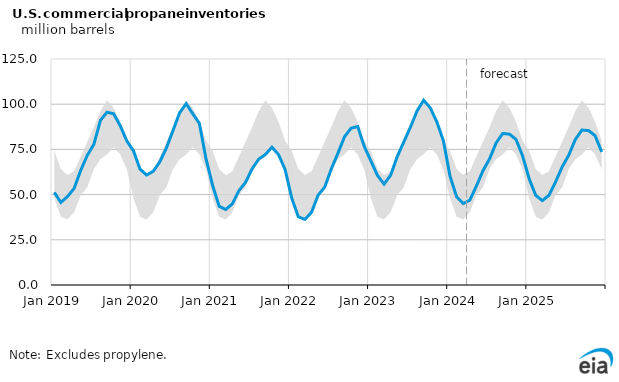
| Category | U.S propane inventories |
|---|---|
| 2019-01-01 | 51.202 |
| 2019-02-01 | 45.695 |
| 2019-03-01 | 48.929 |
| 2019-04-01 | 53.39 |
| 2019-05-01 | 63.351 |
| 2019-06-01 | 71.698 |
| 2019-07-01 | 77.807 |
| 2019-08-01 | 91.091 |
| 2019-09-01 | 95.594 |
| 2019-10-01 | 94.675 |
| 2019-11-01 | 88.094 |
| 2019-12-01 | 79.656 |
| 2020-01-01 | 74.251 |
| 2020-02-01 | 64.101 |
| 2020-03-01 | 60.81 |
| 2020-04-01 | 62.905 |
| 2020-05-01 | 68.11 |
| 2020-06-01 | 75.803 |
| 2020-07-01 | 85.443 |
| 2020-08-01 | 95.255 |
| 2020-09-01 | 100.314 |
| 2020-10-01 | 94.662 |
| 2020-11-01 | 89.388 |
| 2020-12-01 | 69.856 |
| 2021-01-01 | 55.151 |
| 2021-02-01 | 43.514 |
| 2021-03-01 | 41.745 |
| 2021-04-01 | 44.916 |
| 2021-05-01 | 52.225 |
| 2021-06-01 | 56.785 |
| 2021-07-01 | 64.31 |
| 2021-08-01 | 69.606 |
| 2021-09-01 | 72.167 |
| 2021-10-01 | 76.199 |
| 2021-11-01 | 72.115 |
| 2021-12-01 | 63.839 |
| 2022-01-01 | 48.019 |
| 2022-02-01 | 37.734 |
| 2022-03-01 | 36.266 |
| 2022-04-01 | 40.214 |
| 2022-05-01 | 49.671 |
| 2022-06-01 | 54.127 |
| 2022-07-01 | 64.161 |
| 2022-08-01 | 72.838 |
| 2022-09-01 | 81.98 |
| 2022-10-01 | 86.724 |
| 2022-11-01 | 87.672 |
| 2022-12-01 | 76.642 |
| 2023-01-01 | 68.627 |
| 2023-02-01 | 60.61 |
| 2023-03-01 | 55.831 |
| 2023-04-01 | 60.752 |
| 2023-05-01 | 71.059 |
| 2023-06-01 | 79.17 |
| 2023-07-01 | 87.327 |
| 2023-08-01 | 96.275 |
| 2023-09-01 | 102.18 |
| 2023-10-01 | 98.028 |
| 2023-11-01 | 90.236 |
| 2023-12-01 | 79.754 |
| 2024-01-01 | 60.189 |
| 2024-02-01 | 48.798 |
| 2024-03-01 | 45.05 |
| 2024-04-01 | 46.899 |
| 2024-05-01 | 54.731 |
| 2024-06-01 | 63.252 |
| 2024-07-01 | 69.786 |
| 2024-08-01 | 78.621 |
| 2024-09-01 | 83.832 |
| 2024-10-01 | 83.442 |
| 2024-11-01 | 80.526 |
| 2024-12-01 | 71.495 |
| 2025-01-01 | 58.775 |
| 2025-02-01 | 49.558 |
| 2025-03-01 | 46.694 |
| 2025-04-01 | 49.592 |
| 2025-05-01 | 56.991 |
| 2025-06-01 | 65.283 |
| 2025-07-01 | 71.792 |
| 2025-08-01 | 80.482 |
| 2025-09-01 | 85.7 |
| 2025-10-01 | 85.459 |
| 2025-11-01 | 82.595 |
| 2025-12-01 | 73.632 |